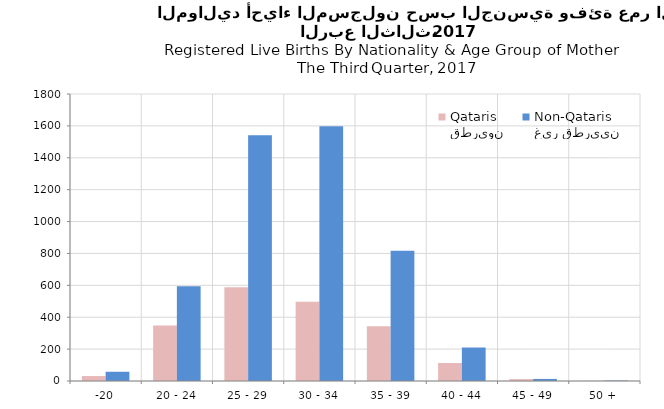
| Category | قطريون
Qataris | غير قطريين
Non-Qataris |
|---|---|---|
| -20 | 31 | 58 |
| 20 - 24 | 348 | 594 |
| 25 - 29 | 588 | 1541 |
| 30 - 34 | 497 | 1597 |
| 35 - 39 | 343 | 817 |
| 40 - 44 | 113 | 210 |
| 45 - 49 | 12 | 13 |
| 50 + | 1 | 3 |